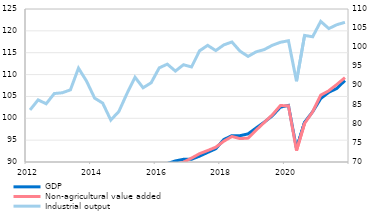
| Category | GDP | Non-agricultural value added |
|---|---|---|
| 2012 | 84.024 | 84.494 |
| II | 85.251 | 85.857 |
| III | 84.299 | 84.659 |
| IV | 84.139 | 84.858 |
| 2013 | 86.026 | 86.24 |
| II | 86.173 | 85.95 |
| III | 87.889 | 88.328 |
| IV | 87.227 | 87.378 |
| 2014 | 86.15 | 86.04 |
| II | 85.49 | 85.033 |
| III | 84.574 | 84.08 |
| IV | 85.877 | 85.282 |
| 2015 | 86.251 | 86.137 |
| II | 87.022 | 86.937 |
| III | 86.911 | 87.029 |
| IV | 87.906 | 88.071 |
| 2016 | 89.156 | 88.746 |
| II | 89.647 | 89.092 |
| III | 90.243 | 89.356 |
| IV | 90.611 | 89.952 |
| 2017 | 90.63 | 90.897 |
| II | 91.344 | 91.908 |
| III | 92.197 | 92.623 |
| IV | 93.033 | 93.385 |
| 2018 | 95.145 | 94.758 |
| II | 96.029 | 95.834 |
| III | 96.021 | 95.353 |
| IV | 96.431 | 95.466 |
| 2019 | 97.789 | 97.287 |
| II | 99.113 | 99.042 |
| III | 100.562 | 100.773 |
| IV | 102.537 | 102.897 |
| 2020 | 102.944 | 102.894 |
| II | 93.083 | 92.606 |
| III | 99.099 | 98.825 |
| IV | 101.494 | 101.494 |
| 2021 | 104.528 | 105.299 |
| II | 105.94 | 106.305 |
| III | 106.844 | 107.769 |
| IV | 108.646 | 109.313 |